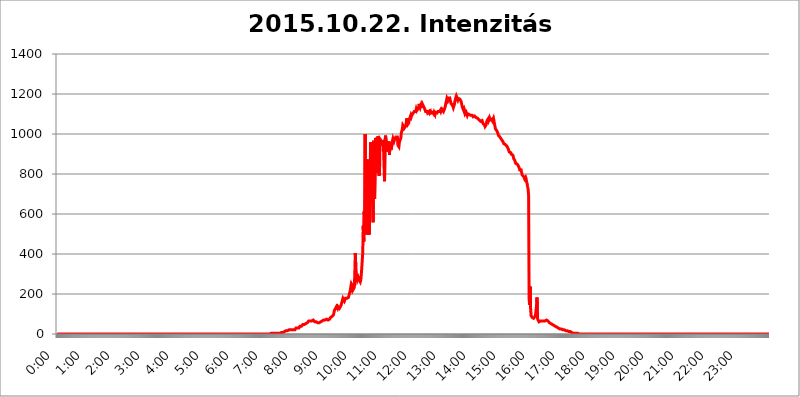
| Category | 2015.10.22. Intenzitás [W/m^2] |
|---|---|
| 0.0 | 0 |
| 0.0006944444444444445 | 0 |
| 0.001388888888888889 | 0 |
| 0.0020833333333333333 | 0 |
| 0.002777777777777778 | 0 |
| 0.003472222222222222 | 0 |
| 0.004166666666666667 | 0 |
| 0.004861111111111111 | 0 |
| 0.005555555555555556 | 0 |
| 0.0062499999999999995 | 0 |
| 0.006944444444444444 | 0 |
| 0.007638888888888889 | 0 |
| 0.008333333333333333 | 0 |
| 0.009027777777777779 | 0 |
| 0.009722222222222222 | 0 |
| 0.010416666666666666 | 0 |
| 0.011111111111111112 | 0 |
| 0.011805555555555555 | 0 |
| 0.012499999999999999 | 0 |
| 0.013194444444444444 | 0 |
| 0.013888888888888888 | 0 |
| 0.014583333333333332 | 0 |
| 0.015277777777777777 | 0 |
| 0.015972222222222224 | 0 |
| 0.016666666666666666 | 0 |
| 0.017361111111111112 | 0 |
| 0.018055555555555557 | 0 |
| 0.01875 | 0 |
| 0.019444444444444445 | 0 |
| 0.02013888888888889 | 0 |
| 0.020833333333333332 | 0 |
| 0.02152777777777778 | 0 |
| 0.022222222222222223 | 0 |
| 0.02291666666666667 | 0 |
| 0.02361111111111111 | 0 |
| 0.024305555555555556 | 0 |
| 0.024999999999999998 | 0 |
| 0.025694444444444447 | 0 |
| 0.02638888888888889 | 0 |
| 0.027083333333333334 | 0 |
| 0.027777777777777776 | 0 |
| 0.02847222222222222 | 0 |
| 0.029166666666666664 | 0 |
| 0.029861111111111113 | 0 |
| 0.030555555555555555 | 0 |
| 0.03125 | 0 |
| 0.03194444444444445 | 0 |
| 0.03263888888888889 | 0 |
| 0.03333333333333333 | 0 |
| 0.034027777777777775 | 0 |
| 0.034722222222222224 | 0 |
| 0.035416666666666666 | 0 |
| 0.036111111111111115 | 0 |
| 0.03680555555555556 | 0 |
| 0.0375 | 0 |
| 0.03819444444444444 | 0 |
| 0.03888888888888889 | 0 |
| 0.03958333333333333 | 0 |
| 0.04027777777777778 | 0 |
| 0.04097222222222222 | 0 |
| 0.041666666666666664 | 0 |
| 0.042361111111111106 | 0 |
| 0.04305555555555556 | 0 |
| 0.043750000000000004 | 0 |
| 0.044444444444444446 | 0 |
| 0.04513888888888889 | 0 |
| 0.04583333333333334 | 0 |
| 0.04652777777777778 | 0 |
| 0.04722222222222222 | 0 |
| 0.04791666666666666 | 0 |
| 0.04861111111111111 | 0 |
| 0.049305555555555554 | 0 |
| 0.049999999999999996 | 0 |
| 0.05069444444444445 | 0 |
| 0.051388888888888894 | 0 |
| 0.052083333333333336 | 0 |
| 0.05277777777777778 | 0 |
| 0.05347222222222222 | 0 |
| 0.05416666666666667 | 0 |
| 0.05486111111111111 | 0 |
| 0.05555555555555555 | 0 |
| 0.05625 | 0 |
| 0.05694444444444444 | 0 |
| 0.057638888888888885 | 0 |
| 0.05833333333333333 | 0 |
| 0.05902777777777778 | 0 |
| 0.059722222222222225 | 0 |
| 0.06041666666666667 | 0 |
| 0.061111111111111116 | 0 |
| 0.06180555555555556 | 0 |
| 0.0625 | 0 |
| 0.06319444444444444 | 0 |
| 0.06388888888888888 | 0 |
| 0.06458333333333334 | 0 |
| 0.06527777777777778 | 0 |
| 0.06597222222222222 | 0 |
| 0.06666666666666667 | 0 |
| 0.06736111111111111 | 0 |
| 0.06805555555555555 | 0 |
| 0.06874999999999999 | 0 |
| 0.06944444444444443 | 0 |
| 0.07013888888888889 | 0 |
| 0.07083333333333333 | 0 |
| 0.07152777777777779 | 0 |
| 0.07222222222222223 | 0 |
| 0.07291666666666667 | 0 |
| 0.07361111111111111 | 0 |
| 0.07430555555555556 | 0 |
| 0.075 | 0 |
| 0.07569444444444444 | 0 |
| 0.0763888888888889 | 0 |
| 0.07708333333333334 | 0 |
| 0.07777777777777778 | 0 |
| 0.07847222222222222 | 0 |
| 0.07916666666666666 | 0 |
| 0.0798611111111111 | 0 |
| 0.08055555555555556 | 0 |
| 0.08125 | 0 |
| 0.08194444444444444 | 0 |
| 0.08263888888888889 | 0 |
| 0.08333333333333333 | 0 |
| 0.08402777777777777 | 0 |
| 0.08472222222222221 | 0 |
| 0.08541666666666665 | 0 |
| 0.08611111111111112 | 0 |
| 0.08680555555555557 | 0 |
| 0.08750000000000001 | 0 |
| 0.08819444444444445 | 0 |
| 0.08888888888888889 | 0 |
| 0.08958333333333333 | 0 |
| 0.09027777777777778 | 0 |
| 0.09097222222222222 | 0 |
| 0.09166666666666667 | 0 |
| 0.09236111111111112 | 0 |
| 0.09305555555555556 | 0 |
| 0.09375 | 0 |
| 0.09444444444444444 | 0 |
| 0.09513888888888888 | 0 |
| 0.09583333333333333 | 0 |
| 0.09652777777777777 | 0 |
| 0.09722222222222222 | 0 |
| 0.09791666666666667 | 0 |
| 0.09861111111111111 | 0 |
| 0.09930555555555555 | 0 |
| 0.09999999999999999 | 0 |
| 0.10069444444444443 | 0 |
| 0.1013888888888889 | 0 |
| 0.10208333333333335 | 0 |
| 0.10277777777777779 | 0 |
| 0.10347222222222223 | 0 |
| 0.10416666666666667 | 0 |
| 0.10486111111111111 | 0 |
| 0.10555555555555556 | 0 |
| 0.10625 | 0 |
| 0.10694444444444444 | 0 |
| 0.1076388888888889 | 0 |
| 0.10833333333333334 | 0 |
| 0.10902777777777778 | 0 |
| 0.10972222222222222 | 0 |
| 0.1111111111111111 | 0 |
| 0.11180555555555556 | 0 |
| 0.11180555555555556 | 0 |
| 0.1125 | 0 |
| 0.11319444444444444 | 0 |
| 0.11388888888888889 | 0 |
| 0.11458333333333333 | 0 |
| 0.11527777777777777 | 0 |
| 0.11597222222222221 | 0 |
| 0.11666666666666665 | 0 |
| 0.1173611111111111 | 0 |
| 0.11805555555555557 | 0 |
| 0.11944444444444445 | 0 |
| 0.12013888888888889 | 0 |
| 0.12083333333333333 | 0 |
| 0.12152777777777778 | 0 |
| 0.12222222222222223 | 0 |
| 0.12291666666666667 | 0 |
| 0.12291666666666667 | 0 |
| 0.12361111111111112 | 0 |
| 0.12430555555555556 | 0 |
| 0.125 | 0 |
| 0.12569444444444444 | 0 |
| 0.12638888888888888 | 0 |
| 0.12708333333333333 | 0 |
| 0.16875 | 0 |
| 0.12847222222222224 | 0 |
| 0.12916666666666668 | 0 |
| 0.12986111111111112 | 0 |
| 0.13055555555555556 | 0 |
| 0.13125 | 0 |
| 0.13194444444444445 | 0 |
| 0.1326388888888889 | 0 |
| 0.13333333333333333 | 0 |
| 0.13402777777777777 | 0 |
| 0.13402777777777777 | 0 |
| 0.13472222222222222 | 0 |
| 0.13541666666666666 | 0 |
| 0.1361111111111111 | 0 |
| 0.13749999999999998 | 0 |
| 0.13819444444444443 | 0 |
| 0.1388888888888889 | 0 |
| 0.13958333333333334 | 0 |
| 0.14027777777777778 | 0 |
| 0.14097222222222222 | 0 |
| 0.14166666666666666 | 0 |
| 0.1423611111111111 | 0 |
| 0.14305555555555557 | 0 |
| 0.14375000000000002 | 0 |
| 0.14444444444444446 | 0 |
| 0.1451388888888889 | 0 |
| 0.1451388888888889 | 0 |
| 0.14652777777777778 | 0 |
| 0.14722222222222223 | 0 |
| 0.14791666666666667 | 0 |
| 0.1486111111111111 | 0 |
| 0.14930555555555555 | 0 |
| 0.15 | 0 |
| 0.15069444444444444 | 0 |
| 0.15138888888888888 | 0 |
| 0.15208333333333332 | 0 |
| 0.15277777777777776 | 0 |
| 0.15347222222222223 | 0 |
| 0.15416666666666667 | 0 |
| 0.15486111111111112 | 0 |
| 0.15555555555555556 | 0 |
| 0.15625 | 0 |
| 0.15694444444444444 | 0 |
| 0.15763888888888888 | 0 |
| 0.15833333333333333 | 0 |
| 0.15902777777777777 | 0 |
| 0.15972222222222224 | 0 |
| 0.16041666666666668 | 0 |
| 0.16111111111111112 | 0 |
| 0.16180555555555556 | 0 |
| 0.1625 | 0 |
| 0.16319444444444445 | 0 |
| 0.1638888888888889 | 0 |
| 0.16458333333333333 | 0 |
| 0.16527777777777777 | 0 |
| 0.16597222222222222 | 0 |
| 0.16666666666666666 | 0 |
| 0.1673611111111111 | 0 |
| 0.16805555555555554 | 0 |
| 0.16874999999999998 | 0 |
| 0.16944444444444443 | 0 |
| 0.17013888888888887 | 0 |
| 0.1708333333333333 | 0 |
| 0.17152777777777775 | 0 |
| 0.17222222222222225 | 0 |
| 0.1729166666666667 | 0 |
| 0.17361111111111113 | 0 |
| 0.17430555555555557 | 0 |
| 0.17500000000000002 | 0 |
| 0.17569444444444446 | 0 |
| 0.1763888888888889 | 0 |
| 0.17708333333333334 | 0 |
| 0.17777777777777778 | 0 |
| 0.17847222222222223 | 0 |
| 0.17916666666666667 | 0 |
| 0.1798611111111111 | 0 |
| 0.18055555555555555 | 0 |
| 0.18125 | 0 |
| 0.18194444444444444 | 0 |
| 0.1826388888888889 | 0 |
| 0.18333333333333335 | 0 |
| 0.1840277777777778 | 0 |
| 0.18472222222222223 | 0 |
| 0.18541666666666667 | 0 |
| 0.18611111111111112 | 0 |
| 0.18680555555555556 | 0 |
| 0.1875 | 0 |
| 0.18819444444444444 | 0 |
| 0.18888888888888888 | 0 |
| 0.18958333333333333 | 0 |
| 0.19027777777777777 | 0 |
| 0.1909722222222222 | 0 |
| 0.19166666666666665 | 0 |
| 0.19236111111111112 | 0 |
| 0.19305555555555554 | 0 |
| 0.19375 | 0 |
| 0.19444444444444445 | 0 |
| 0.1951388888888889 | 0 |
| 0.19583333333333333 | 0 |
| 0.19652777777777777 | 0 |
| 0.19722222222222222 | 0 |
| 0.19791666666666666 | 0 |
| 0.1986111111111111 | 0 |
| 0.19930555555555554 | 0 |
| 0.19999999999999998 | 0 |
| 0.20069444444444443 | 0 |
| 0.20138888888888887 | 0 |
| 0.2020833333333333 | 0 |
| 0.2027777777777778 | 0 |
| 0.2034722222222222 | 0 |
| 0.2041666666666667 | 0 |
| 0.20486111111111113 | 0 |
| 0.20555555555555557 | 0 |
| 0.20625000000000002 | 0 |
| 0.20694444444444446 | 0 |
| 0.2076388888888889 | 0 |
| 0.20833333333333334 | 0 |
| 0.20902777777777778 | 0 |
| 0.20972222222222223 | 0 |
| 0.21041666666666667 | 0 |
| 0.2111111111111111 | 0 |
| 0.21180555555555555 | 0 |
| 0.2125 | 0 |
| 0.21319444444444444 | 0 |
| 0.2138888888888889 | 0 |
| 0.21458333333333335 | 0 |
| 0.2152777777777778 | 0 |
| 0.21597222222222223 | 0 |
| 0.21666666666666667 | 0 |
| 0.21736111111111112 | 0 |
| 0.21805555555555556 | 0 |
| 0.21875 | 0 |
| 0.21944444444444444 | 0 |
| 0.22013888888888888 | 0 |
| 0.22083333333333333 | 0 |
| 0.22152777777777777 | 0 |
| 0.2222222222222222 | 0 |
| 0.22291666666666665 | 0 |
| 0.2236111111111111 | 0 |
| 0.22430555555555556 | 0 |
| 0.225 | 0 |
| 0.22569444444444445 | 0 |
| 0.2263888888888889 | 0 |
| 0.22708333333333333 | 0 |
| 0.22777777777777777 | 0 |
| 0.22847222222222222 | 0 |
| 0.22916666666666666 | 0 |
| 0.2298611111111111 | 0 |
| 0.23055555555555554 | 0 |
| 0.23124999999999998 | 0 |
| 0.23194444444444443 | 0 |
| 0.23263888888888887 | 0 |
| 0.2333333333333333 | 0 |
| 0.2340277777777778 | 0 |
| 0.2347222222222222 | 0 |
| 0.2354166666666667 | 0 |
| 0.23611111111111113 | 0 |
| 0.23680555555555557 | 0 |
| 0.23750000000000002 | 0 |
| 0.23819444444444446 | 0 |
| 0.2388888888888889 | 0 |
| 0.23958333333333334 | 0 |
| 0.24027777777777778 | 0 |
| 0.24097222222222223 | 0 |
| 0.24166666666666667 | 0 |
| 0.2423611111111111 | 0 |
| 0.24305555555555555 | 0 |
| 0.24375 | 0 |
| 0.24444444444444446 | 0 |
| 0.24513888888888888 | 0 |
| 0.24583333333333335 | 0 |
| 0.2465277777777778 | 0 |
| 0.24722222222222223 | 0 |
| 0.24791666666666667 | 0 |
| 0.24861111111111112 | 0 |
| 0.24930555555555556 | 0 |
| 0.25 | 0 |
| 0.25069444444444444 | 0 |
| 0.2513888888888889 | 0 |
| 0.2520833333333333 | 0 |
| 0.25277777777777777 | 0 |
| 0.2534722222222222 | 0 |
| 0.25416666666666665 | 0 |
| 0.2548611111111111 | 0 |
| 0.2555555555555556 | 0 |
| 0.25625000000000003 | 0 |
| 0.2569444444444445 | 0 |
| 0.2576388888888889 | 0 |
| 0.25833333333333336 | 0 |
| 0.2590277777777778 | 0 |
| 0.25972222222222224 | 0 |
| 0.2604166666666667 | 0 |
| 0.2611111111111111 | 0 |
| 0.26180555555555557 | 0 |
| 0.2625 | 0 |
| 0.26319444444444445 | 0 |
| 0.2638888888888889 | 0 |
| 0.26458333333333334 | 0 |
| 0.2652777777777778 | 0 |
| 0.2659722222222222 | 0 |
| 0.26666666666666666 | 0 |
| 0.2673611111111111 | 0 |
| 0.26805555555555555 | 0 |
| 0.26875 | 0 |
| 0.26944444444444443 | 0 |
| 0.2701388888888889 | 0 |
| 0.2708333333333333 | 0 |
| 0.27152777777777776 | 0 |
| 0.2722222222222222 | 0 |
| 0.27291666666666664 | 0 |
| 0.2736111111111111 | 0 |
| 0.2743055555555555 | 0 |
| 0.27499999999999997 | 0 |
| 0.27569444444444446 | 0 |
| 0.27638888888888885 | 0 |
| 0.27708333333333335 | 0 |
| 0.2777777777777778 | 0 |
| 0.27847222222222223 | 0 |
| 0.2791666666666667 | 0 |
| 0.2798611111111111 | 0 |
| 0.28055555555555556 | 0 |
| 0.28125 | 0 |
| 0.28194444444444444 | 0 |
| 0.2826388888888889 | 0 |
| 0.2833333333333333 | 0 |
| 0.28402777777777777 | 0 |
| 0.2847222222222222 | 0 |
| 0.28541666666666665 | 0 |
| 0.28611111111111115 | 0 |
| 0.28680555555555554 | 0 |
| 0.28750000000000003 | 0 |
| 0.2881944444444445 | 0 |
| 0.2888888888888889 | 0 |
| 0.28958333333333336 | 0 |
| 0.2902777777777778 | 0 |
| 0.29097222222222224 | 0 |
| 0.2916666666666667 | 0 |
| 0.2923611111111111 | 0 |
| 0.29305555555555557 | 0 |
| 0.29375 | 0 |
| 0.29444444444444445 | 0 |
| 0.2951388888888889 | 0 |
| 0.29583333333333334 | 0 |
| 0.2965277777777778 | 0 |
| 0.2972222222222222 | 0 |
| 0.29791666666666666 | 0 |
| 0.2986111111111111 | 0 |
| 0.29930555555555555 | 3.525 |
| 0.3 | 3.525 |
| 0.30069444444444443 | 3.525 |
| 0.3013888888888889 | 3.525 |
| 0.3020833333333333 | 3.525 |
| 0.30277777777777776 | 3.525 |
| 0.3034722222222222 | 3.525 |
| 0.30416666666666664 | 3.525 |
| 0.3048611111111111 | 3.525 |
| 0.3055555555555555 | 3.525 |
| 0.30624999999999997 | 3.525 |
| 0.3069444444444444 | 3.525 |
| 0.3076388888888889 | 3.525 |
| 0.30833333333333335 | 3.525 |
| 0.3090277777777778 | 3.525 |
| 0.30972222222222223 | 3.525 |
| 0.3104166666666667 | 3.525 |
| 0.3111111111111111 | 3.525 |
| 0.31180555555555556 | 3.525 |
| 0.3125 | 3.525 |
| 0.31319444444444444 | 3.525 |
| 0.3138888888888889 | 7.887 |
| 0.3145833333333333 | 7.887 |
| 0.31527777777777777 | 7.887 |
| 0.3159722222222222 | 7.887 |
| 0.31666666666666665 | 7.887 |
| 0.31736111111111115 | 7.887 |
| 0.31805555555555554 | 12.257 |
| 0.31875000000000003 | 12.257 |
| 0.3194444444444445 | 16.636 |
| 0.3201388888888889 | 16.636 |
| 0.32083333333333336 | 16.636 |
| 0.3215277777777778 | 16.636 |
| 0.32222222222222224 | 16.636 |
| 0.3229166666666667 | 16.636 |
| 0.3236111111111111 | 16.636 |
| 0.32430555555555557 | 21.024 |
| 0.325 | 21.024 |
| 0.32569444444444445 | 21.024 |
| 0.3263888888888889 | 21.024 |
| 0.32708333333333334 | 21.024 |
| 0.3277777777777778 | 21.024 |
| 0.3284722222222222 | 21.024 |
| 0.32916666666666666 | 21.024 |
| 0.3298611111111111 | 21.024 |
| 0.33055555555555555 | 21.024 |
| 0.33125 | 21.024 |
| 0.33194444444444443 | 21.024 |
| 0.3326388888888889 | 21.024 |
| 0.3333333333333333 | 21.024 |
| 0.3340277777777778 | 25.419 |
| 0.3347222222222222 | 29.823 |
| 0.3354166666666667 | 29.823 |
| 0.3361111111111111 | 29.823 |
| 0.3368055555555556 | 29.823 |
| 0.33749999999999997 | 29.823 |
| 0.33819444444444446 | 29.823 |
| 0.33888888888888885 | 29.823 |
| 0.33958333333333335 | 34.234 |
| 0.34027777777777773 | 38.653 |
| 0.34097222222222223 | 34.234 |
| 0.3416666666666666 | 34.234 |
| 0.3423611111111111 | 38.653 |
| 0.3430555555555555 | 38.653 |
| 0.34375 | 43.079 |
| 0.3444444444444445 | 47.511 |
| 0.3451388888888889 | 47.511 |
| 0.3458333333333334 | 47.511 |
| 0.34652777777777777 | 47.511 |
| 0.34722222222222227 | 47.511 |
| 0.34791666666666665 | 51.951 |
| 0.34861111111111115 | 51.951 |
| 0.34930555555555554 | 47.511 |
| 0.35000000000000003 | 51.951 |
| 0.3506944444444444 | 56.398 |
| 0.3513888888888889 | 56.398 |
| 0.3520833333333333 | 60.85 |
| 0.3527777777777778 | 65.31 |
| 0.3534722222222222 | 65.31 |
| 0.3541666666666667 | 65.31 |
| 0.3548611111111111 | 65.31 |
| 0.35555555555555557 | 65.31 |
| 0.35625 | 65.31 |
| 0.35694444444444445 | 65.31 |
| 0.3576388888888889 | 69.775 |
| 0.35833333333333334 | 69.775 |
| 0.3590277777777778 | 69.775 |
| 0.3597222222222222 | 69.775 |
| 0.36041666666666666 | 65.31 |
| 0.3611111111111111 | 60.85 |
| 0.36180555555555555 | 56.398 |
| 0.3625 | 56.398 |
| 0.36319444444444443 | 60.85 |
| 0.3638888888888889 | 60.85 |
| 0.3645833333333333 | 60.85 |
| 0.3652777777777778 | 56.398 |
| 0.3659722222222222 | 56.398 |
| 0.3666666666666667 | 56.398 |
| 0.3673611111111111 | 56.398 |
| 0.3680555555555556 | 56.398 |
| 0.36874999999999997 | 60.85 |
| 0.36944444444444446 | 60.85 |
| 0.37013888888888885 | 56.398 |
| 0.37083333333333335 | 56.398 |
| 0.37152777777777773 | 65.31 |
| 0.37222222222222223 | 65.31 |
| 0.3729166666666666 | 65.31 |
| 0.3736111111111111 | 69.775 |
| 0.3743055555555555 | 65.31 |
| 0.375 | 69.775 |
| 0.3756944444444445 | 69.775 |
| 0.3763888888888889 | 69.775 |
| 0.3770833333333334 | 74.246 |
| 0.37777777777777777 | 74.246 |
| 0.37847222222222227 | 69.775 |
| 0.37916666666666665 | 69.775 |
| 0.37986111111111115 | 69.775 |
| 0.38055555555555554 | 69.775 |
| 0.38125000000000003 | 74.246 |
| 0.3819444444444444 | 74.246 |
| 0.3826388888888889 | 74.246 |
| 0.3833333333333333 | 83.205 |
| 0.3840277777777778 | 83.205 |
| 0.3847222222222222 | 87.692 |
| 0.3854166666666667 | 87.692 |
| 0.3861111111111111 | 92.184 |
| 0.38680555555555557 | 92.184 |
| 0.3875 | 96.682 |
| 0.38819444444444445 | 110.201 |
| 0.3888888888888889 | 119.235 |
| 0.38958333333333334 | 119.235 |
| 0.3902777777777778 | 128.284 |
| 0.3909722222222222 | 132.814 |
| 0.39166666666666666 | 137.347 |
| 0.3923611111111111 | 132.814 |
| 0.39305555555555555 | 128.284 |
| 0.39375 | 137.347 |
| 0.39444444444444443 | 141.884 |
| 0.3951388888888889 | 137.347 |
| 0.3958333333333333 | 128.284 |
| 0.3965277777777778 | 128.284 |
| 0.3972222222222222 | 132.814 |
| 0.3979166666666667 | 141.884 |
| 0.3986111111111111 | 150.964 |
| 0.3993055555555556 | 160.056 |
| 0.39999999999999997 | 169.156 |
| 0.40069444444444446 | 178.264 |
| 0.40138888888888885 | 178.264 |
| 0.40208333333333335 | 173.709 |
| 0.40277777777777773 | 164.605 |
| 0.40347222222222223 | 169.156 |
| 0.4041666666666666 | 178.264 |
| 0.4048611111111111 | 182.82 |
| 0.4055555555555555 | 173.709 |
| 0.40625 | 178.264 |
| 0.4069444444444445 | 178.264 |
| 0.4076388888888889 | 182.82 |
| 0.4083333333333334 | 182.82 |
| 0.40902777777777777 | 191.937 |
| 0.40972222222222227 | 201.058 |
| 0.41041666666666665 | 210.182 |
| 0.41111111111111115 | 219.309 |
| 0.41180555555555554 | 237.564 |
| 0.41250000000000003 | 251.251 |
| 0.4131944444444444 | 246.689 |
| 0.4138888888888889 | 242.127 |
| 0.4145833333333333 | 219.309 |
| 0.4152777777777778 | 219.309 |
| 0.4159722222222222 | 219.309 |
| 0.4166666666666667 | 233 |
| 0.4173611111111111 | 305.898 |
| 0.41805555555555557 | 405.108 |
| 0.41875 | 333.113 |
| 0.41944444444444445 | 305.898 |
| 0.4201388888888889 | 283.156 |
| 0.42083333333333334 | 269.49 |
| 0.4215277777777778 | 269.49 |
| 0.4222222222222222 | 283.156 |
| 0.42291666666666666 | 278.603 |
| 0.4236111111111111 | 269.49 |
| 0.42430555555555555 | 264.932 |
| 0.425 | 260.373 |
| 0.42569444444444443 | 269.49 |
| 0.4263888888888889 | 296.808 |
| 0.4270833333333333 | 328.584 |
| 0.4277777777777778 | 369.23 |
| 0.4284722222222222 | 405.108 |
| 0.4291666666666667 | 541.121 |
| 0.4298611111111111 | 462.786 |
| 0.4305555555555556 | 613.252 |
| 0.43124999999999997 | 566.793 |
| 0.43194444444444446 | 999.916 |
| 0.43263888888888885 | 532.513 |
| 0.43333333333333335 | 506.542 |
| 0.43402777777777773 | 497.836 |
| 0.43472222222222223 | 872.114 |
| 0.4354166666666666 | 771.559 |
| 0.4361111111111111 | 497.836 |
| 0.4368055555555555 | 541.121 |
| 0.4375 | 497.836 |
| 0.4381944444444445 | 592.233 |
| 0.4388888888888889 | 837.682 |
| 0.4395833333333334 | 958.814 |
| 0.44027777777777777 | 687.544 |
| 0.44097222222222227 | 806.757 |
| 0.44166666666666665 | 731.896 |
| 0.44236111111111115 | 642.4 |
| 0.44305555555555554 | 558.261 |
| 0.44375000000000003 | 966.295 |
| 0.4444444444444444 | 715.858 |
| 0.4451388888888889 | 675.311 |
| 0.4458333333333333 | 837.682 |
| 0.4465277777777778 | 981.244 |
| 0.4472222222222222 | 970.034 |
| 0.4479166666666667 | 970.034 |
| 0.4486111111111111 | 806.757 |
| 0.44930555555555557 | 962.555 |
| 0.45 | 988.714 |
| 0.45069444444444445 | 925.06 |
| 0.4513888888888889 | 791.169 |
| 0.45208333333333334 | 822.26 |
| 0.4527777777777778 | 973.772 |
| 0.4534722222222222 | 973.772 |
| 0.45416666666666666 | 966.295 |
| 0.4548611111111111 | 970.034 |
| 0.45555555555555555 | 955.071 |
| 0.45625 | 970.034 |
| 0.45694444444444443 | 962.555 |
| 0.4576388888888889 | 925.06 |
| 0.4583333333333333 | 841.526 |
| 0.4590277777777778 | 763.674 |
| 0.4597222222222222 | 962.555 |
| 0.4604166666666667 | 992.448 |
| 0.4611111111111111 | 992.448 |
| 0.4618055555555556 | 947.58 |
| 0.46249999999999997 | 909.996 |
| 0.46319444444444446 | 962.555 |
| 0.46388888888888885 | 940.082 |
| 0.46458333333333335 | 943.832 |
| 0.46527777777777773 | 962.555 |
| 0.46597222222222223 | 894.885 |
| 0.4666666666666666 | 958.814 |
| 0.4673611111111111 | 947.58 |
| 0.4680555555555555 | 921.298 |
| 0.46875 | 928.819 |
| 0.4694444444444445 | 951.327 |
| 0.4701388888888889 | 966.295 |
| 0.4708333333333334 | 977.508 |
| 0.47152777777777777 | 973.772 |
| 0.47222222222222227 | 962.555 |
| 0.47291666666666665 | 962.555 |
| 0.47361111111111115 | 977.508 |
| 0.47430555555555554 | 973.772 |
| 0.47500000000000003 | 984.98 |
| 0.4756944444444444 | 981.244 |
| 0.4763888888888889 | 981.244 |
| 0.4770833333333333 | 984.98 |
| 0.4777777777777778 | 943.832 |
| 0.4784722222222222 | 947.58 |
| 0.4791666666666667 | 936.33 |
| 0.4798611111111111 | 958.814 |
| 0.48055555555555557 | 958.814 |
| 0.48125 | 958.814 |
| 0.48194444444444445 | 981.244 |
| 0.4826388888888889 | 1007.383 |
| 0.48333333333333334 | 1014.852 |
| 0.4840277777777778 | 1026.06 |
| 0.4847222222222222 | 1044.762 |
| 0.48541666666666666 | 1044.762 |
| 0.4861111111111111 | 1037.277 |
| 0.48680555555555555 | 1029.798 |
| 0.4875 | 1026.06 |
| 0.48819444444444443 | 1029.798 |
| 0.4888888888888889 | 1041.019 |
| 0.4895833333333333 | 1059.756 |
| 0.4902777777777778 | 1078.555 |
| 0.4909722222222222 | 1059.756 |
| 0.4916666666666667 | 1048.508 |
| 0.4923611111111111 | 1052.255 |
| 0.4930555555555556 | 1056.004 |
| 0.49374999999999997 | 1074.789 |
| 0.49444444444444446 | 1074.789 |
| 0.49513888888888885 | 1086.097 |
| 0.49583333333333335 | 1093.653 |
| 0.49652777777777773 | 1086.097 |
| 0.49722222222222223 | 1093.653 |
| 0.4979166666666666 | 1097.437 |
| 0.4986111111111111 | 1101.226 |
| 0.4993055555555555 | 1101.226 |
| 0.5 | 1105.019 |
| 0.5006944444444444 | 1112.618 |
| 0.5013888888888889 | 1108.816 |
| 0.5020833333333333 | 1108.816 |
| 0.5027777777777778 | 1112.618 |
| 0.5034722222222222 | 1124.056 |
| 0.5041666666666667 | 1116.426 |
| 0.5048611111111111 | 1116.426 |
| 0.5055555555555555 | 1124.056 |
| 0.50625 | 1120.238 |
| 0.5069444444444444 | 1135.543 |
| 0.5076388888888889 | 1150.946 |
| 0.5083333333333333 | 1139.384 |
| 0.5090277777777777 | 1131.708 |
| 0.5097222222222222 | 1139.384 |
| 0.5104166666666666 | 1147.086 |
| 0.5111111111111112 | 1139.384 |
| 0.5118055555555555 | 1131.708 |
| 0.5125000000000001 | 1147.086 |
| 0.5131944444444444 | 1150.946 |
| 0.513888888888889 | 1150.946 |
| 0.5145833333333333 | 1131.708 |
| 0.5152777777777778 | 1127.879 |
| 0.5159722222222222 | 1120.238 |
| 0.5166666666666667 | 1112.618 |
| 0.517361111111111 | 1116.426 |
| 0.5180555555555556 | 1116.426 |
| 0.5187499999999999 | 1112.618 |
| 0.5194444444444445 | 1105.019 |
| 0.5201388888888888 | 1108.816 |
| 0.5208333333333334 | 1108.816 |
| 0.5215277777777778 | 1112.618 |
| 0.5222222222222223 | 1105.019 |
| 0.5229166666666667 | 1108.816 |
| 0.5236111111111111 | 1112.618 |
| 0.5243055555555556 | 1105.019 |
| 0.525 | 1105.019 |
| 0.5256944444444445 | 1105.019 |
| 0.5263888888888889 | 1108.816 |
| 0.5270833333333333 | 1108.816 |
| 0.5277777777777778 | 1101.226 |
| 0.5284722222222222 | 1108.816 |
| 0.5291666666666667 | 1105.019 |
| 0.5298611111111111 | 1097.437 |
| 0.5305555555555556 | 1108.816 |
| 0.53125 | 1108.816 |
| 0.5319444444444444 | 1108.816 |
| 0.5326388888888889 | 1105.019 |
| 0.5333333333333333 | 1108.816 |
| 0.5340277777777778 | 1112.618 |
| 0.5347222222222222 | 1116.426 |
| 0.5354166666666667 | 1116.426 |
| 0.5361111111111111 | 1112.618 |
| 0.5368055555555555 | 1112.618 |
| 0.5375 | 1120.238 |
| 0.5381944444444444 | 1112.618 |
| 0.5388888888888889 | 1116.426 |
| 0.5395833333333333 | 1124.056 |
| 0.5402777777777777 | 1120.238 |
| 0.5409722222222222 | 1124.056 |
| 0.5416666666666666 | 1112.618 |
| 0.5423611111111112 | 1108.816 |
| 0.5430555555555555 | 1108.816 |
| 0.5437500000000001 | 1131.708 |
| 0.5444444444444444 | 1143.232 |
| 0.545138888888889 | 1154.814 |
| 0.5458333333333333 | 1158.689 |
| 0.5465277777777778 | 1178.177 |
| 0.5472222222222222 | 1178.177 |
| 0.5479166666666667 | 1166.46 |
| 0.548611111111111 | 1170.358 |
| 0.5493055555555556 | 1178.177 |
| 0.5499999999999999 | 1186.03 |
| 0.5506944444444445 | 1174.263 |
| 0.5513888888888888 | 1166.46 |
| 0.5520833333333334 | 1154.814 |
| 0.5527777777777778 | 1150.946 |
| 0.5534722222222223 | 1147.086 |
| 0.5541666666666667 | 1143.232 |
| 0.5548611111111111 | 1139.384 |
| 0.5555555555555556 | 1131.708 |
| 0.55625 | 1127.879 |
| 0.5569444444444445 | 1147.086 |
| 0.5576388888888889 | 1162.571 |
| 0.5583333333333333 | 1166.46 |
| 0.5590277777777778 | 1182.099 |
| 0.5597222222222222 | 1189.969 |
| 0.5604166666666667 | 1186.03 |
| 0.5611111111111111 | 1189.969 |
| 0.5618055555555556 | 1170.358 |
| 0.5625 | 1178.177 |
| 0.5631944444444444 | 1178.177 |
| 0.5638888888888889 | 1174.263 |
| 0.5645833333333333 | 1174.263 |
| 0.5652777777777778 | 1174.263 |
| 0.5659722222222222 | 1166.46 |
| 0.5666666666666667 | 1158.689 |
| 0.5673611111111111 | 1147.086 |
| 0.5680555555555555 | 1135.543 |
| 0.56875 | 1131.708 |
| 0.5694444444444444 | 1131.708 |
| 0.5701388888888889 | 1116.426 |
| 0.5708333333333333 | 1124.056 |
| 0.5715277777777777 | 1116.426 |
| 0.5722222222222222 | 1101.226 |
| 0.5729166666666666 | 1105.019 |
| 0.5736111111111112 | 1108.816 |
| 0.5743055555555555 | 1105.019 |
| 0.5750000000000001 | 1093.653 |
| 0.5756944444444444 | 1101.226 |
| 0.576388888888889 | 1101.226 |
| 0.5770833333333333 | 1097.437 |
| 0.5777777777777778 | 1097.437 |
| 0.5784722222222222 | 1097.437 |
| 0.5791666666666667 | 1097.437 |
| 0.579861111111111 | 1093.653 |
| 0.5805555555555556 | 1093.653 |
| 0.5812499999999999 | 1093.653 |
| 0.5819444444444445 | 1093.653 |
| 0.5826388888888888 | 1093.653 |
| 0.5833333333333334 | 1086.097 |
| 0.5840277777777778 | 1089.873 |
| 0.5847222222222223 | 1089.873 |
| 0.5854166666666667 | 1089.873 |
| 0.5861111111111111 | 1086.097 |
| 0.5868055555555556 | 1093.653 |
| 0.5875 | 1082.324 |
| 0.5881944444444445 | 1082.324 |
| 0.5888888888888889 | 1082.324 |
| 0.5895833333333333 | 1078.555 |
| 0.5902777777777778 | 1074.789 |
| 0.5909722222222222 | 1074.789 |
| 0.5916666666666667 | 1071.027 |
| 0.5923611111111111 | 1067.267 |
| 0.5930555555555556 | 1067.267 |
| 0.59375 | 1063.51 |
| 0.5944444444444444 | 1067.267 |
| 0.5951388888888889 | 1067.267 |
| 0.5958333333333333 | 1067.267 |
| 0.5965277777777778 | 1059.756 |
| 0.5972222222222222 | 1052.255 |
| 0.5979166666666667 | 1048.508 |
| 0.5986111111111111 | 1048.508 |
| 0.5993055555555555 | 1044.762 |
| 0.6 | 1037.277 |
| 0.6006944444444444 | 1041.019 |
| 0.6013888888888889 | 1044.762 |
| 0.6020833333333333 | 1056.004 |
| 0.6027777777777777 | 1067.267 |
| 0.6034722222222222 | 1071.027 |
| 0.6041666666666666 | 1074.789 |
| 0.6048611111111112 | 1067.267 |
| 0.6055555555555555 | 1067.267 |
| 0.6062500000000001 | 1082.324 |
| 0.6069444444444444 | 1078.555 |
| 0.607638888888889 | 1071.027 |
| 0.6083333333333333 | 1074.789 |
| 0.6090277777777778 | 1067.267 |
| 0.6097222222222222 | 1074.789 |
| 0.6104166666666667 | 1067.267 |
| 0.611111111111111 | 1063.51 |
| 0.6118055555555556 | 1078.555 |
| 0.6124999999999999 | 1074.789 |
| 0.6131944444444445 | 1052.255 |
| 0.6138888888888888 | 1048.508 |
| 0.6145833333333334 | 1026.06 |
| 0.6152777777777778 | 1029.798 |
| 0.6159722222222223 | 1022.323 |
| 0.6166666666666667 | 1014.852 |
| 0.6173611111111111 | 1011.118 |
| 0.6180555555555556 | 1003.65 |
| 0.61875 | 992.448 |
| 0.6194444444444445 | 988.714 |
| 0.6201388888888889 | 992.448 |
| 0.6208333333333333 | 984.98 |
| 0.6215277777777778 | 981.244 |
| 0.6222222222222222 | 977.508 |
| 0.6229166666666667 | 981.244 |
| 0.6236111111111111 | 970.034 |
| 0.6243055555555556 | 970.034 |
| 0.625 | 962.555 |
| 0.6256944444444444 | 958.814 |
| 0.6263888888888889 | 951.327 |
| 0.6270833333333333 | 951.327 |
| 0.6277777777777778 | 955.071 |
| 0.6284722222222222 | 947.58 |
| 0.6291666666666667 | 947.58 |
| 0.6298611111111111 | 943.832 |
| 0.6305555555555555 | 940.082 |
| 0.63125 | 936.33 |
| 0.6319444444444444 | 936.33 |
| 0.6326388888888889 | 925.06 |
| 0.6333333333333333 | 917.534 |
| 0.6340277777777777 | 909.996 |
| 0.6347222222222222 | 913.766 |
| 0.6354166666666666 | 909.996 |
| 0.6361111111111112 | 906.223 |
| 0.6368055555555555 | 898.668 |
| 0.6375000000000001 | 902.447 |
| 0.6381944444444444 | 902.447 |
| 0.638888888888889 | 894.885 |
| 0.6395833333333333 | 887.309 |
| 0.6402777777777778 | 875.918 |
| 0.6409722222222222 | 875.918 |
| 0.6416666666666667 | 868.305 |
| 0.642361111111111 | 868.305 |
| 0.6430555555555556 | 853.029 |
| 0.6437499999999999 | 853.029 |
| 0.6444444444444445 | 853.029 |
| 0.6451388888888888 | 849.199 |
| 0.6458333333333334 | 845.365 |
| 0.6465277777777778 | 841.526 |
| 0.6472222222222223 | 837.682 |
| 0.6479166666666667 | 829.981 |
| 0.6486111111111111 | 822.26 |
| 0.6493055555555556 | 814.519 |
| 0.65 | 826.123 |
| 0.6506944444444445 | 814.519 |
| 0.6513888888888889 | 806.757 |
| 0.6520833333333333 | 795.074 |
| 0.6527777777777778 | 798.974 |
| 0.6534722222222222 | 795.074 |
| 0.6541666666666667 | 787.258 |
| 0.6548611111111111 | 783.342 |
| 0.6555555555555556 | 775.492 |
| 0.65625 | 771.559 |
| 0.6569444444444444 | 783.342 |
| 0.6576388888888889 | 775.492 |
| 0.6583333333333333 | 759.723 |
| 0.6590277777777778 | 751.803 |
| 0.6597222222222222 | 735.89 |
| 0.6604166666666667 | 723.889 |
| 0.6611111111111111 | 691.608 |
| 0.6618055555555555 | 173.709 |
| 0.6625 | 146.423 |
| 0.6631944444444444 | 237.564 |
| 0.6638888888888889 | 128.284 |
| 0.6645833333333333 | 92.184 |
| 0.6652777777777777 | 87.692 |
| 0.6659722222222222 | 83.205 |
| 0.6666666666666666 | 83.205 |
| 0.6673611111111111 | 78.722 |
| 0.6680555555555556 | 78.722 |
| 0.6687500000000001 | 83.205 |
| 0.6694444444444444 | 83.205 |
| 0.6701388888888888 | 87.692 |
| 0.6708333333333334 | 96.682 |
| 0.6715277777777778 | 101.184 |
| 0.6722222222222222 | 141.884 |
| 0.6729166666666666 | 182.82 |
| 0.6736111111111112 | 78.722 |
| 0.6743055555555556 | 69.775 |
| 0.6749999999999999 | 65.31 |
| 0.6756944444444444 | 60.85 |
| 0.6763888888888889 | 60.85 |
| 0.6770833333333334 | 60.85 |
| 0.6777777777777777 | 65.31 |
| 0.6784722222222223 | 65.31 |
| 0.6791666666666667 | 65.31 |
| 0.6798611111111111 | 65.31 |
| 0.6805555555555555 | 65.31 |
| 0.68125 | 65.31 |
| 0.6819444444444445 | 65.31 |
| 0.6826388888888889 | 60.85 |
| 0.6833333333333332 | 60.85 |
| 0.6840277777777778 | 65.31 |
| 0.6847222222222222 | 65.31 |
| 0.6854166666666667 | 69.775 |
| 0.686111111111111 | 69.775 |
| 0.6868055555555556 | 65.31 |
| 0.6875 | 65.31 |
| 0.6881944444444444 | 65.31 |
| 0.688888888888889 | 60.85 |
| 0.6895833333333333 | 60.85 |
| 0.6902777777777778 | 56.398 |
| 0.6909722222222222 | 56.398 |
| 0.6916666666666668 | 56.398 |
| 0.6923611111111111 | 51.951 |
| 0.6930555555555555 | 47.511 |
| 0.69375 | 47.511 |
| 0.6944444444444445 | 47.511 |
| 0.6951388888888889 | 47.511 |
| 0.6958333333333333 | 43.079 |
| 0.6965277777777777 | 43.079 |
| 0.6972222222222223 | 38.653 |
| 0.6979166666666666 | 38.653 |
| 0.6986111111111111 | 38.653 |
| 0.6993055555555556 | 38.653 |
| 0.7000000000000001 | 38.653 |
| 0.7006944444444444 | 34.234 |
| 0.7013888888888888 | 34.234 |
| 0.7020833333333334 | 34.234 |
| 0.7027777777777778 | 29.823 |
| 0.7034722222222222 | 29.823 |
| 0.7041666666666666 | 29.823 |
| 0.7048611111111112 | 25.419 |
| 0.7055555555555556 | 25.419 |
| 0.7062499999999999 | 25.419 |
| 0.7069444444444444 | 25.419 |
| 0.7076388888888889 | 25.419 |
| 0.7083333333333334 | 21.024 |
| 0.7090277777777777 | 21.024 |
| 0.7097222222222223 | 21.024 |
| 0.7104166666666667 | 21.024 |
| 0.7111111111111111 | 21.024 |
| 0.7118055555555555 | 21.024 |
| 0.7125 | 21.024 |
| 0.7131944444444445 | 16.636 |
| 0.7138888888888889 | 16.636 |
| 0.7145833333333332 | 16.636 |
| 0.7152777777777778 | 16.636 |
| 0.7159722222222222 | 12.257 |
| 0.7166666666666667 | 12.257 |
| 0.717361111111111 | 12.257 |
| 0.7180555555555556 | 12.257 |
| 0.71875 | 12.257 |
| 0.7194444444444444 | 12.257 |
| 0.720138888888889 | 7.887 |
| 0.7208333333333333 | 7.887 |
| 0.7215277777777778 | 7.887 |
| 0.7222222222222222 | 7.887 |
| 0.7229166666666668 | 3.525 |
| 0.7236111111111111 | 3.525 |
| 0.7243055555555555 | 3.525 |
| 0.725 | 3.525 |
| 0.7256944444444445 | 3.525 |
| 0.7263888888888889 | 3.525 |
| 0.7270833333333333 | 3.525 |
| 0.7277777777777777 | 3.525 |
| 0.7284722222222223 | 3.525 |
| 0.7291666666666666 | 3.525 |
| 0.7298611111111111 | 3.525 |
| 0.7305555555555556 | 0 |
| 0.7312500000000001 | 0 |
| 0.7319444444444444 | 0 |
| 0.7326388888888888 | 0 |
| 0.7333333333333334 | 0 |
| 0.7340277777777778 | 0 |
| 0.7347222222222222 | 0 |
| 0.7354166666666666 | 0 |
| 0.7361111111111112 | 0 |
| 0.7368055555555556 | 0 |
| 0.7374999999999999 | 0 |
| 0.7381944444444444 | 0 |
| 0.7388888888888889 | 0 |
| 0.7395833333333334 | 0 |
| 0.7402777777777777 | 0 |
| 0.7409722222222223 | 0 |
| 0.7416666666666667 | 0 |
| 0.7423611111111111 | 0 |
| 0.7430555555555555 | 0 |
| 0.74375 | 0 |
| 0.7444444444444445 | 0 |
| 0.7451388888888889 | 0 |
| 0.7458333333333332 | 0 |
| 0.7465277777777778 | 0 |
| 0.7472222222222222 | 0 |
| 0.7479166666666667 | 0 |
| 0.748611111111111 | 0 |
| 0.7493055555555556 | 0 |
| 0.75 | 0 |
| 0.7506944444444444 | 0 |
| 0.751388888888889 | 0 |
| 0.7520833333333333 | 0 |
| 0.7527777777777778 | 0 |
| 0.7534722222222222 | 0 |
| 0.7541666666666668 | 0 |
| 0.7548611111111111 | 0 |
| 0.7555555555555555 | 0 |
| 0.75625 | 0 |
| 0.7569444444444445 | 0 |
| 0.7576388888888889 | 0 |
| 0.7583333333333333 | 0 |
| 0.7590277777777777 | 0 |
| 0.7597222222222223 | 0 |
| 0.7604166666666666 | 0 |
| 0.7611111111111111 | 0 |
| 0.7618055555555556 | 0 |
| 0.7625000000000001 | 0 |
| 0.7631944444444444 | 0 |
| 0.7638888888888888 | 0 |
| 0.7645833333333334 | 0 |
| 0.7652777777777778 | 0 |
| 0.7659722222222222 | 0 |
| 0.7666666666666666 | 0 |
| 0.7673611111111112 | 0 |
| 0.7680555555555556 | 0 |
| 0.7687499999999999 | 0 |
| 0.7694444444444444 | 0 |
| 0.7701388888888889 | 0 |
| 0.7708333333333334 | 0 |
| 0.7715277777777777 | 0 |
| 0.7722222222222223 | 0 |
| 0.7729166666666667 | 0 |
| 0.7736111111111111 | 0 |
| 0.7743055555555555 | 0 |
| 0.775 | 0 |
| 0.7756944444444445 | 0 |
| 0.7763888888888889 | 0 |
| 0.7770833333333332 | 0 |
| 0.7777777777777778 | 0 |
| 0.7784722222222222 | 0 |
| 0.7791666666666667 | 0 |
| 0.779861111111111 | 0 |
| 0.7805555555555556 | 0 |
| 0.78125 | 0 |
| 0.7819444444444444 | 0 |
| 0.782638888888889 | 0 |
| 0.7833333333333333 | 0 |
| 0.7840277777777778 | 0 |
| 0.7847222222222222 | 0 |
| 0.7854166666666668 | 0 |
| 0.7861111111111111 | 0 |
| 0.7868055555555555 | 0 |
| 0.7875 | 0 |
| 0.7881944444444445 | 0 |
| 0.7888888888888889 | 0 |
| 0.7895833333333333 | 0 |
| 0.7902777777777777 | 0 |
| 0.7909722222222223 | 0 |
| 0.7916666666666666 | 0 |
| 0.7923611111111111 | 0 |
| 0.7930555555555556 | 0 |
| 0.7937500000000001 | 0 |
| 0.7944444444444444 | 0 |
| 0.7951388888888888 | 0 |
| 0.7958333333333334 | 0 |
| 0.7965277777777778 | 0 |
| 0.7972222222222222 | 0 |
| 0.7979166666666666 | 0 |
| 0.7986111111111112 | 0 |
| 0.7993055555555556 | 0 |
| 0.7999999999999999 | 0 |
| 0.8006944444444444 | 0 |
| 0.8013888888888889 | 0 |
| 0.8020833333333334 | 0 |
| 0.8027777777777777 | 0 |
| 0.8034722222222223 | 0 |
| 0.8041666666666667 | 0 |
| 0.8048611111111111 | 0 |
| 0.8055555555555555 | 0 |
| 0.80625 | 0 |
| 0.8069444444444445 | 0 |
| 0.8076388888888889 | 0 |
| 0.8083333333333332 | 0 |
| 0.8090277777777778 | 0 |
| 0.8097222222222222 | 0 |
| 0.8104166666666667 | 0 |
| 0.811111111111111 | 0 |
| 0.8118055555555556 | 0 |
| 0.8125 | 0 |
| 0.8131944444444444 | 0 |
| 0.813888888888889 | 0 |
| 0.8145833333333333 | 0 |
| 0.8152777777777778 | 0 |
| 0.8159722222222222 | 0 |
| 0.8166666666666668 | 0 |
| 0.8173611111111111 | 0 |
| 0.8180555555555555 | 0 |
| 0.81875 | 0 |
| 0.8194444444444445 | 0 |
| 0.8201388888888889 | 0 |
| 0.8208333333333333 | 0 |
| 0.8215277777777777 | 0 |
| 0.8222222222222223 | 0 |
| 0.8229166666666666 | 0 |
| 0.8236111111111111 | 0 |
| 0.8243055555555556 | 0 |
| 0.8250000000000001 | 0 |
| 0.8256944444444444 | 0 |
| 0.8263888888888888 | 0 |
| 0.8270833333333334 | 0 |
| 0.8277777777777778 | 0 |
| 0.8284722222222222 | 0 |
| 0.8291666666666666 | 0 |
| 0.8298611111111112 | 0 |
| 0.8305555555555556 | 0 |
| 0.8312499999999999 | 0 |
| 0.8319444444444444 | 0 |
| 0.8326388888888889 | 0 |
| 0.8333333333333334 | 0 |
| 0.8340277777777777 | 0 |
| 0.8347222222222223 | 0 |
| 0.8354166666666667 | 0 |
| 0.8361111111111111 | 0 |
| 0.8368055555555555 | 0 |
| 0.8375 | 0 |
| 0.8381944444444445 | 0 |
| 0.8388888888888889 | 0 |
| 0.8395833333333332 | 0 |
| 0.8402777777777778 | 0 |
| 0.8409722222222222 | 0 |
| 0.8416666666666667 | 0 |
| 0.842361111111111 | 0 |
| 0.8430555555555556 | 0 |
| 0.84375 | 0 |
| 0.8444444444444444 | 0 |
| 0.845138888888889 | 0 |
| 0.8458333333333333 | 0 |
| 0.8465277777777778 | 0 |
| 0.8472222222222222 | 0 |
| 0.8479166666666668 | 0 |
| 0.8486111111111111 | 0 |
| 0.8493055555555555 | 0 |
| 0.85 | 0 |
| 0.8506944444444445 | 0 |
| 0.8513888888888889 | 0 |
| 0.8520833333333333 | 0 |
| 0.8527777777777777 | 0 |
| 0.8534722222222223 | 0 |
| 0.8541666666666666 | 0 |
| 0.8548611111111111 | 0 |
| 0.8555555555555556 | 0 |
| 0.8562500000000001 | 0 |
| 0.8569444444444444 | 0 |
| 0.8576388888888888 | 0 |
| 0.8583333333333334 | 0 |
| 0.8590277777777778 | 0 |
| 0.8597222222222222 | 0 |
| 0.8604166666666666 | 0 |
| 0.8611111111111112 | 0 |
| 0.8618055555555556 | 0 |
| 0.8624999999999999 | 0 |
| 0.8631944444444444 | 0 |
| 0.8638888888888889 | 0 |
| 0.8645833333333334 | 0 |
| 0.8652777777777777 | 0 |
| 0.8659722222222223 | 0 |
| 0.8666666666666667 | 0 |
| 0.8673611111111111 | 0 |
| 0.8680555555555555 | 0 |
| 0.86875 | 0 |
| 0.8694444444444445 | 0 |
| 0.8701388888888889 | 0 |
| 0.8708333333333332 | 0 |
| 0.8715277777777778 | 0 |
| 0.8722222222222222 | 0 |
| 0.8729166666666667 | 0 |
| 0.873611111111111 | 0 |
| 0.8743055555555556 | 0 |
| 0.875 | 0 |
| 0.8756944444444444 | 0 |
| 0.876388888888889 | 0 |
| 0.8770833333333333 | 0 |
| 0.8777777777777778 | 0 |
| 0.8784722222222222 | 0 |
| 0.8791666666666668 | 0 |
| 0.8798611111111111 | 0 |
| 0.8805555555555555 | 0 |
| 0.88125 | 0 |
| 0.8819444444444445 | 0 |
| 0.8826388888888889 | 0 |
| 0.8833333333333333 | 0 |
| 0.8840277777777777 | 0 |
| 0.8847222222222223 | 0 |
| 0.8854166666666666 | 0 |
| 0.8861111111111111 | 0 |
| 0.8868055555555556 | 0 |
| 0.8875000000000001 | 0 |
| 0.8881944444444444 | 0 |
| 0.8888888888888888 | 0 |
| 0.8895833333333334 | 0 |
| 0.8902777777777778 | 0 |
| 0.8909722222222222 | 0 |
| 0.8916666666666666 | 0 |
| 0.8923611111111112 | 0 |
| 0.8930555555555556 | 0 |
| 0.8937499999999999 | 0 |
| 0.8944444444444444 | 0 |
| 0.8951388888888889 | 0 |
| 0.8958333333333334 | 0 |
| 0.8965277777777777 | 0 |
| 0.8972222222222223 | 0 |
| 0.8979166666666667 | 0 |
| 0.8986111111111111 | 0 |
| 0.8993055555555555 | 0 |
| 0.9 | 0 |
| 0.9006944444444445 | 0 |
| 0.9013888888888889 | 0 |
| 0.9020833333333332 | 0 |
| 0.9027777777777778 | 0 |
| 0.9034722222222222 | 0 |
| 0.9041666666666667 | 0 |
| 0.904861111111111 | 0 |
| 0.9055555555555556 | 0 |
| 0.90625 | 0 |
| 0.9069444444444444 | 0 |
| 0.907638888888889 | 0 |
| 0.9083333333333333 | 0 |
| 0.9090277777777778 | 0 |
| 0.9097222222222222 | 0 |
| 0.9104166666666668 | 0 |
| 0.9111111111111111 | 0 |
| 0.9118055555555555 | 0 |
| 0.9125 | 0 |
| 0.9131944444444445 | 0 |
| 0.9138888888888889 | 0 |
| 0.9145833333333333 | 0 |
| 0.9152777777777777 | 0 |
| 0.9159722222222223 | 0 |
| 0.9166666666666666 | 0 |
| 0.9173611111111111 | 0 |
| 0.9180555555555556 | 0 |
| 0.9187500000000001 | 0 |
| 0.9194444444444444 | 0 |
| 0.9201388888888888 | 0 |
| 0.9208333333333334 | 0 |
| 0.9215277777777778 | 0 |
| 0.9222222222222222 | 0 |
| 0.9229166666666666 | 0 |
| 0.9236111111111112 | 0 |
| 0.9243055555555556 | 0 |
| 0.9249999999999999 | 0 |
| 0.9256944444444444 | 0 |
| 0.9263888888888889 | 0 |
| 0.9270833333333334 | 0 |
| 0.9277777777777777 | 0 |
| 0.9284722222222223 | 0 |
| 0.9291666666666667 | 0 |
| 0.9298611111111111 | 0 |
| 0.9305555555555555 | 0 |
| 0.93125 | 0 |
| 0.9319444444444445 | 0 |
| 0.9326388888888889 | 0 |
| 0.9333333333333332 | 0 |
| 0.9340277777777778 | 0 |
| 0.9347222222222222 | 0 |
| 0.9354166666666667 | 0 |
| 0.936111111111111 | 0 |
| 0.9368055555555556 | 0 |
| 0.9375 | 0 |
| 0.9381944444444444 | 0 |
| 0.938888888888889 | 0 |
| 0.9395833333333333 | 0 |
| 0.9402777777777778 | 0 |
| 0.9409722222222222 | 0 |
| 0.9416666666666668 | 0 |
| 0.9423611111111111 | 0 |
| 0.9430555555555555 | 0 |
| 0.94375 | 0 |
| 0.9444444444444445 | 0 |
| 0.9451388888888889 | 0 |
| 0.9458333333333333 | 0 |
| 0.9465277777777777 | 0 |
| 0.9472222222222223 | 0 |
| 0.9479166666666666 | 0 |
| 0.9486111111111111 | 0 |
| 0.9493055555555556 | 0 |
| 0.9500000000000001 | 0 |
| 0.9506944444444444 | 0 |
| 0.9513888888888888 | 0 |
| 0.9520833333333334 | 0 |
| 0.9527777777777778 | 0 |
| 0.9534722222222222 | 0 |
| 0.9541666666666666 | 0 |
| 0.9548611111111112 | 0 |
| 0.9555555555555556 | 0 |
| 0.9562499999999999 | 0 |
| 0.9569444444444444 | 0 |
| 0.9576388888888889 | 0 |
| 0.9583333333333334 | 0 |
| 0.9590277777777777 | 0 |
| 0.9597222222222223 | 0 |
| 0.9604166666666667 | 0 |
| 0.9611111111111111 | 0 |
| 0.9618055555555555 | 0 |
| 0.9625 | 0 |
| 0.9631944444444445 | 0 |
| 0.9638888888888889 | 0 |
| 0.9645833333333332 | 0 |
| 0.9652777777777778 | 0 |
| 0.9659722222222222 | 0 |
| 0.9666666666666667 | 0 |
| 0.967361111111111 | 0 |
| 0.9680555555555556 | 0 |
| 0.96875 | 0 |
| 0.9694444444444444 | 0 |
| 0.970138888888889 | 0 |
| 0.9708333333333333 | 0 |
| 0.9715277777777778 | 0 |
| 0.9722222222222222 | 0 |
| 0.9729166666666668 | 0 |
| 0.9736111111111111 | 0 |
| 0.9743055555555555 | 0 |
| 0.975 | 0 |
| 0.9756944444444445 | 0 |
| 0.9763888888888889 | 0 |
| 0.9770833333333333 | 0 |
| 0.9777777777777777 | 0 |
| 0.9784722222222223 | 0 |
| 0.9791666666666666 | 0 |
| 0.9798611111111111 | 0 |
| 0.9805555555555556 | 0 |
| 0.9812500000000001 | 0 |
| 0.9819444444444444 | 0 |
| 0.9826388888888888 | 0 |
| 0.9833333333333334 | 0 |
| 0.9840277777777778 | 0 |
| 0.9847222222222222 | 0 |
| 0.9854166666666666 | 0 |
| 0.9861111111111112 | 0 |
| 0.9868055555555556 | 0 |
| 0.9874999999999999 | 0 |
| 0.9881944444444444 | 0 |
| 0.9888888888888889 | 0 |
| 0.9895833333333334 | 0 |
| 0.9902777777777777 | 0 |
| 0.9909722222222223 | 0 |
| 0.9916666666666667 | 0 |
| 0.9923611111111111 | 0 |
| 0.9930555555555555 | 0 |
| 0.99375 | 0 |
| 0.9944444444444445 | 0 |
| 0.9951388888888889 | 0 |
| 0.9958333333333332 | 0 |
| 0.9965277777777778 | 0 |
| 0.9972222222222222 | 0 |
| 0.9979166666666667 | 0 |
| 0.998611111111111 | 0 |
| 0.9993055555555556 | 0 |